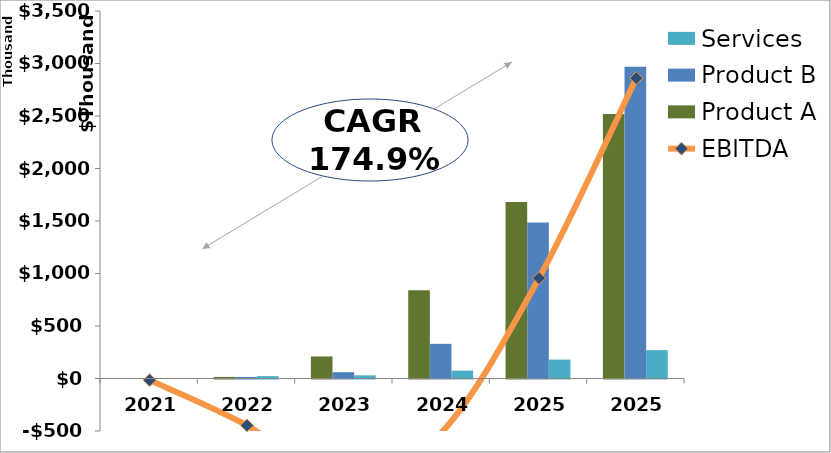
| Category | Product A | Product B | Services |
|---|---|---|---|
|  2021  | 0 | 0 | 0 |
|  2022  | 15000 | 15000 | 22500 |
|  2023  | 210000 | 60000 | 30000 |
|  2024  | 840000 | 330000 | 75000 |
|  2025  | 1680000 | 1485000 | 180000 |
|  2025  | 2520000 | 2970000 | 270000 |